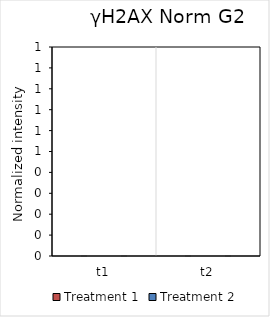
| Category | Treatment 1 | Treatment 2 |
|---|---|---|
| t1 | 0 | 0 |
| t2 | 0 | 0 |